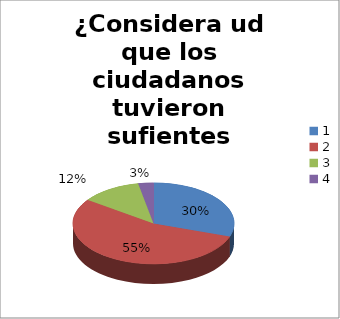
| Category | Series 0 |
|---|---|
| 0 | 30 |
| 1 | 54 |
| 2 | 12 |
| 3 | 3 |